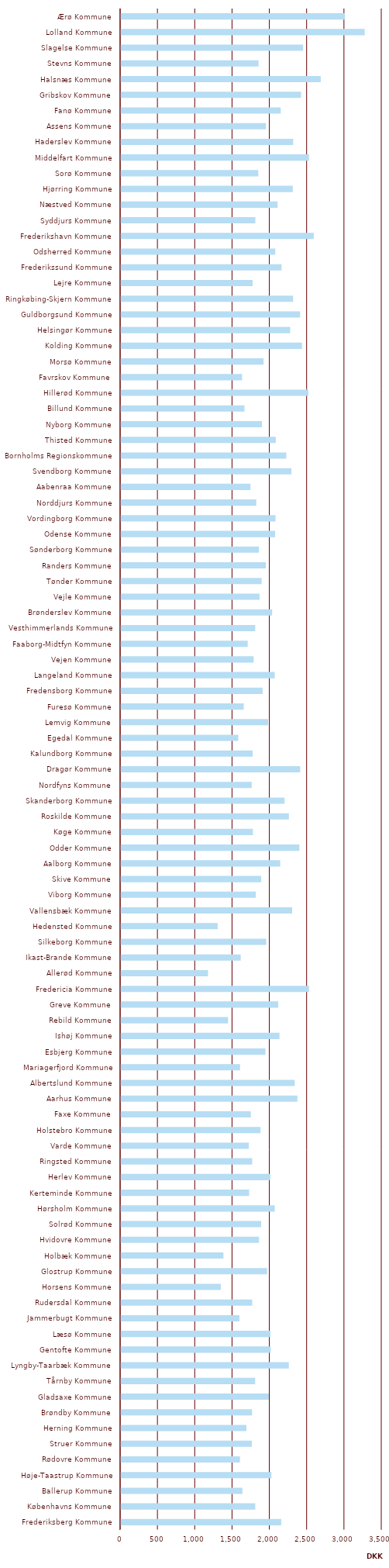
| Category | Drikkevand |
|---|---|
| Ærø Kommune | 3003.023 |
| Lolland Kommune | 3268.256 |
| Slagelse Kommune | 2441.804 |
| Stevns Kommune | 1844.837 |
| Halsnæs Kommune | 2679.196 |
| Gribskov Kommune | 2414.707 |
| Fanø Kommune | 2141.904 |
| Assens Kommune | 1943.949 |
| Haderslev Kommune | 2309.295 |
| Middelfart Kommune | 2521.702 |
| Sorø Kommune | 1841.438 |
| Hjørring Kommune | 2304.075 |
| Næstved Kommune | 2100.276 |
| Syddjurs Kommune | 1801.879 |
| Frederikshavn Kommune | 2585.25 |
| Odsherred Kommune | 2069.411 |
| Frederikssund Kommune | 2153.869 |
| Lejre Kommune | 1765.447 |
| Ringkøbing-Skjern Kommune | 2308.084 |
| Guldborgsund Kommune | 2402.394 |
| Helsingør Kommune | 2269.515 |
| Kolding Kommune | 2426.442 |
| Morsø Kommune | 1911.782 |
| Favrskov Kommune | 1624.23 |
| Hillerød Kommune | 2512.826 |
| Billund Kommune | 1656.771 |
| Nyborg Kommune | 1890.137 |
| Thisted Kommune | 2076.008 |
| Bornholms Regionskommune | 2215.985 |
| Svendborg Kommune | 2285.736 |
| Aabenraa Kommune | 1736.648 |
| Norddjurs Kommune | 1814.651 |
| Vordingborg Kommune | 2072.612 |
| Odense Kommune | 2067.35 |
| Sønderborg Kommune | 1849.519 |
| Randers Kommune | 1942.928 |
| Tønder Kommune | 1885.963 |
| Vejle Kommune | 1858.741 |
| Brønderslev Kommune | 2027.016 |
| Vesthimmerlands Kommune | 1800.407 |
| Faaborg-Midtfyn Kommune | 1699.734 |
| Vejen Kommune | 1779.517 |
| Langeland Kommune | 2062.023 |
| Fredensborg Kommune | 1899.569 |
| Furesø Kommune | 1646.702 |
| Lemvig Kommune | 1972.523 |
| Egedal Kommune | 1573.229 |
| Kalundborg Kommune | 1766.055 |
| Dragør Kommune | 2402.695 |
| Nordfyns Kommune | 1753.683 |
| Skanderborg Kommune | 2194.079 |
| Roskilde Kommune | 2251.959 |
| Køge Kommune | 1768.951 |
| Odder Kommune | 2391.944 |
| Aalborg Kommune | 2135.2 |
| Skive Kommune | 1880.572 |
| Viborg Kommune | 1807.468 |
| Vallensbæk Kommune | 2295.175 |
| Hedensted Kommune | 1297.028 |
| Silkeborg Kommune | 1948.072 |
| Ikast-Brande Kommune | 1606.013 |
| Allerød Kommune | 1167.586 |
| Fredericia Kommune | 2521.702 |
| Greve Kommune | 2109.475 |
| Rebild Kommune | 1436.305 |
| Ishøj Kommune | 2125.496 |
| Esbjerg Kommune | 1937.631 |
| Mariagerfjord Kommune | 1596.495 |
| Albertslund Kommune | 2329.047 |
| Aarhus Kommune | 2365.595 |
| Faxe Kommune | 1741.526 |
| Holstebro Kommune | 1872.037 |
| Varde Kommune | 1714.261 |
| Ringsted Kommune | 1759.818 |
| Herlev Kommune | 2003.48 |
| Kerteminde Kommune | 1718.538 |
| Hørsholm Kommune | 2062.4 |
| Solrød Kommune | 1879.356 |
| Hvidovre Kommune | 1850.415 |
| Holbæk Kommune | 1374.275 |
| Glostrup Kommune | 1960.18 |
| Horsens Kommune | 1339.002 |
| Rudersdal Kommune | 1759.964 |
| Jammerbugt Kommune | 1588.607 |
| Læsø Kommune | 2004.36 |
| Gentofte Kommune | 2008.722 |
| Lyngby-Taarbæk Kommune | 2250.901 |
| Tårnby Kommune | 1799.486 |
| Gladsaxe Kommune | 1983.561 |
| Brøndby Kommune | 1758.397 |
| Herning Kommune | 1682.475 |
| Struer Kommune | 1755.081 |
| Rødovre Kommune | 1595.655 |
| Høje-Taastrup Kommune | 2017.11 |
| Ballerup Kommune | 1629.623 |
| Københavns Kommune | 1800.976 |
| Frederiksberg Kommune | 2148.076 |